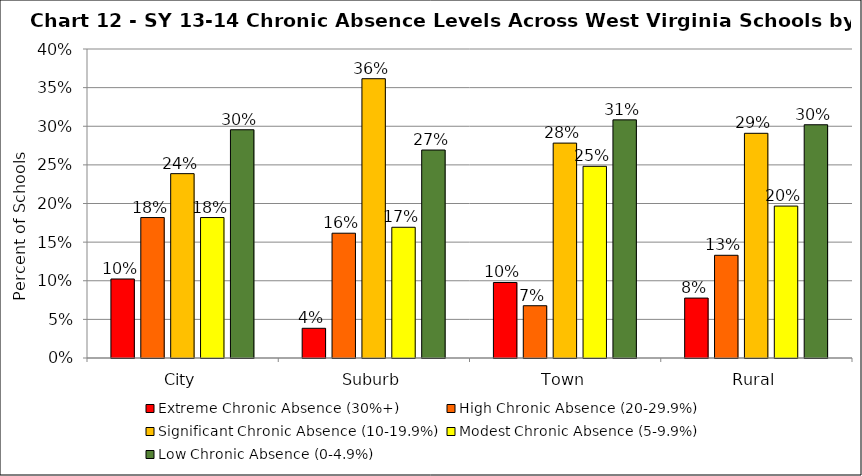
| Category | Extreme Chronic Absence (30%+) | High Chronic Absence (20-29.9%) | Significant Chronic Absence (10-19.9%) | Modest Chronic Absence (5-9.9%) | Low Chronic Absence (0-4.9%) |
|---|---|---|---|---|---|
| 0 | 0.102 | 0.182 | 0.239 | 0.182 | 0.295 |
| 1 | 0.038 | 0.162 | 0.362 | 0.169 | 0.269 |
| 2 | 0.098 | 0.068 | 0.278 | 0.248 | 0.308 |
| 3 | 0.078 | 0.133 | 0.291 | 0.197 | 0.302 |